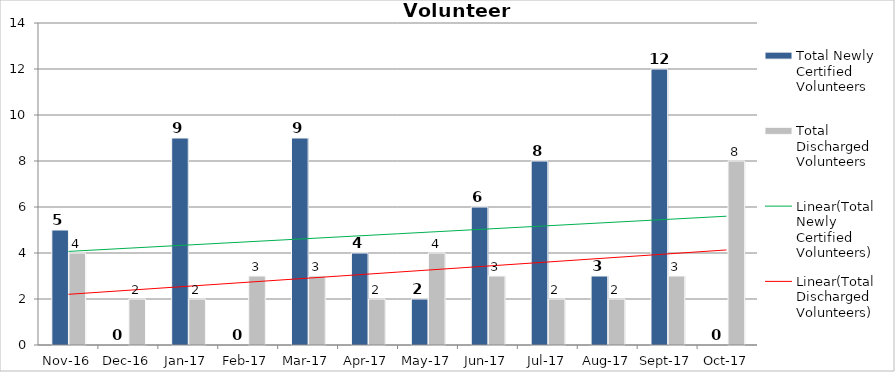
| Category | Total Newly Certified Volunteers | Total Discharged Volunteers |
|---|---|---|
| 2016-11-01 | 5 | 4 |
| 2016-12-01 | 0 | 2 |
| 2017-01-01 | 9 | 2 |
| 2017-02-01 | 0 | 3 |
| 2017-03-01 | 9 | 3 |
| 2017-04-01 | 4 | 2 |
| 2017-05-01 | 2 | 4 |
| 2017-06-01 | 6 | 3 |
| 2017-07-01 | 8 | 2 |
| 2017-08-01 | 3 | 2 |
| 2017-09-01 | 12 | 3 |
| 2017-10-01 | 0 | 8 |